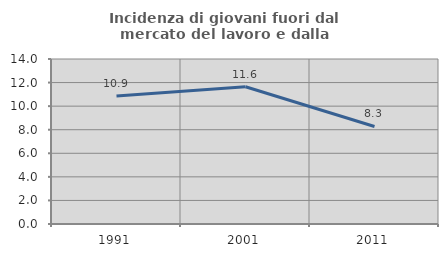
| Category | Incidenza di giovani fuori dal mercato del lavoro e dalla formazione  |
|---|---|
| 1991.0 | 10.86 |
| 2001.0 | 11.642 |
| 2011.0 | 8.276 |